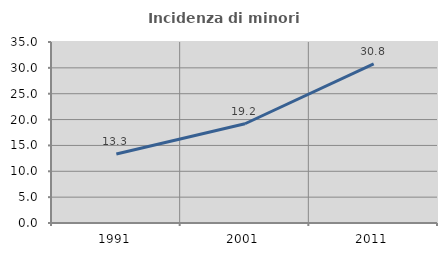
| Category | Incidenza di minori stranieri |
|---|---|
| 1991.0 | 13.333 |
| 2001.0 | 19.192 |
| 2011.0 | 30.769 |